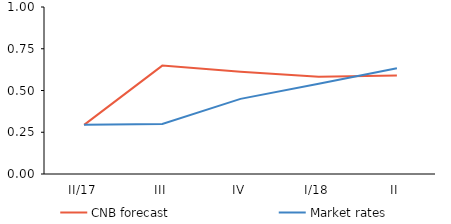
| Category | CNB forecast | Market rates |
|---|---|---|
| II/17 | 0.294 | 0.294 |
| III | 0.649 | 0.3 |
| IV | 0.612 | 0.45 |
| I/18 | 0.583 | 0.54 |
| II | 0.589 | 0.633 |